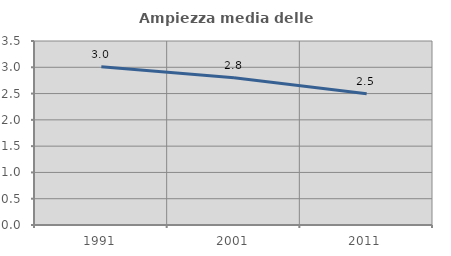
| Category | Ampiezza media delle famiglie |
|---|---|
| 1991.0 | 3.01 |
| 2001.0 | 2.799 |
| 2011.0 | 2.495 |